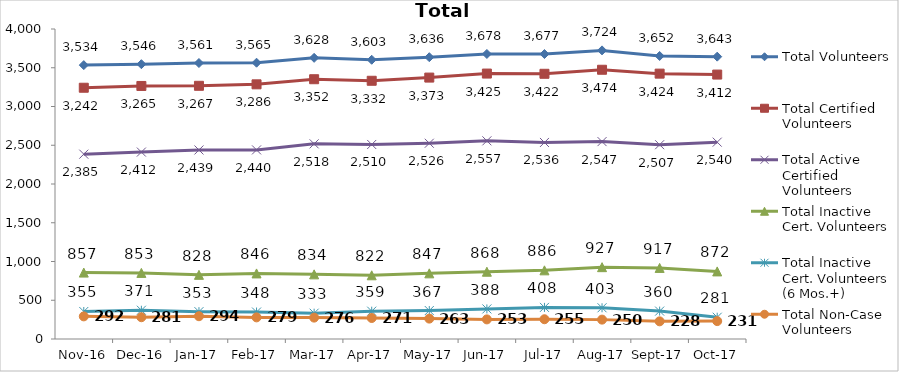
| Category | Total Volunteers | Total Certified Volunteers | Total Active Certified Volunteers | Total Inactive Cert. Volunteers | Total Inactive Cert. Volunteers (6 Mos.+) | Total Non-Case Volunteers |
|---|---|---|---|---|---|---|
| 2016-11-01 | 3534 | 3242 | 2385 | 857 | 355 | 292 |
| 2016-12-01 | 3546 | 3265 | 2412 | 853 | 371 | 281 |
| 2017-01-01 | 3561 | 3267 | 2439 | 828 | 353 | 294 |
| 2017-02-01 | 3565 | 3286 | 2440 | 846 | 348 | 279 |
| 2017-03-01 | 3628 | 3352 | 2518 | 834 | 333 | 276 |
| 2017-04-01 | 3603 | 3332 | 2510 | 822 | 359 | 271 |
| 2017-05-01 | 3636 | 3373 | 2526 | 847 | 367 | 263 |
| 2017-06-01 | 3678 | 3425 | 2557 | 868 | 388 | 253 |
| 2017-07-01 | 3677 | 3422 | 2536 | 886 | 408 | 255 |
| 2017-08-01 | 3724 | 3474 | 2547 | 927 | 403 | 250 |
| 2017-09-01 | 3652 | 3424 | 2507 | 917 | 360 | 228 |
| 2017-10-01 | 3643 | 3412 | 2540 | 872 | 281 | 231 |